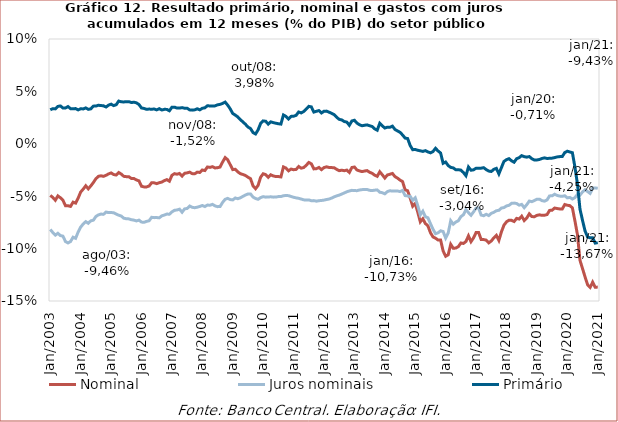
| Category | Nominal | Juros nominais | Primário |
|---|---|---|---|
| 2003-01-01 | -0.049 | -0.082 | 0.032 |
| 2003-02-01 | -0.051 | -0.085 | 0.034 |
| 2003-03-01 | -0.054 | -0.087 | 0.033 |
| 2003-04-01 | -0.05 | -0.085 | 0.036 |
| 2003-05-01 | -0.051 | -0.088 | 0.036 |
| 2003-06-01 | -0.054 | -0.088 | 0.034 |
| 2003-07-01 | -0.059 | -0.093 | 0.034 |
| 2003-08-01 | -0.059 | -0.095 | 0.036 |
| 2003-09-01 | -0.06 | -0.093 | 0.034 |
| 2003-10-01 | -0.056 | -0.089 | 0.033 |
| 2003-11-01 | -0.057 | -0.09 | 0.034 |
| 2003-12-01 | -0.052 | -0.084 | 0.032 |
| 2004-01-01 | -0.046 | -0.079 | 0.033 |
| 2004-02-01 | -0.043 | -0.076 | 0.033 |
| 2004-03-01 | -0.04 | -0.074 | 0.034 |
| 2004-04-01 | -0.043 | -0.076 | 0.033 |
| 2004-05-01 | -0.04 | -0.073 | 0.033 |
| 2004-06-01 | -0.037 | -0.073 | 0.036 |
| 2004-07-01 | -0.033 | -0.069 | 0.036 |
| 2004-08-01 | -0.031 | -0.068 | 0.037 |
| 2004-09-01 | -0.031 | -0.067 | 0.036 |
| 2004-10-01 | -0.031 | -0.067 | 0.036 |
| 2004-11-01 | -0.03 | -0.065 | 0.035 |
| 2004-12-01 | -0.029 | -0.066 | 0.037 |
| 2005-01-01 | -0.028 | -0.066 | 0.038 |
| 2005-02-01 | -0.029 | -0.066 | 0.036 |
| 2005-03-01 | -0.03 | -0.067 | 0.037 |
| 2005-04-01 | -0.027 | -0.068 | 0.041 |
| 2005-05-01 | -0.029 | -0.069 | 0.04 |
| 2005-06-01 | -0.031 | -0.071 | 0.04 |
| 2005-07-01 | -0.031 | -0.072 | 0.04 |
| 2005-08-01 | -0.031 | -0.072 | 0.04 |
| 2005-09-01 | -0.033 | -0.072 | 0.039 |
| 2005-10-01 | -0.033 | -0.073 | 0.04 |
| 2005-11-01 | -0.034 | -0.074 | 0.039 |
| 2005-12-01 | -0.035 | -0.073 | 0.037 |
| 2006-01-01 | -0.041 | -0.075 | 0.034 |
| 2006-02-01 | -0.041 | -0.075 | 0.034 |
| 2006-03-01 | -0.041 | -0.074 | 0.033 |
| 2006-04-01 | -0.04 | -0.073 | 0.033 |
| 2006-05-01 | -0.037 | -0.07 | 0.033 |
| 2006-06-01 | -0.037 | -0.07 | 0.033 |
| 2006-07-01 | -0.038 | -0.07 | 0.032 |
| 2006-08-01 | -0.037 | -0.071 | 0.034 |
| 2006-09-01 | -0.037 | -0.069 | 0.032 |
| 2006-10-01 | -0.035 | -0.068 | 0.033 |
| 2006-11-01 | -0.034 | -0.067 | 0.033 |
| 2006-12-01 | -0.036 | -0.067 | 0.032 |
| 2007-01-01 | -0.03 | -0.065 | 0.035 |
| 2007-02-01 | -0.028 | -0.063 | 0.035 |
| 2007-03-01 | -0.029 | -0.063 | 0.034 |
| 2007-04-01 | -0.028 | -0.062 | 0.034 |
| 2007-05-01 | -0.031 | -0.065 | 0.035 |
| 2007-06-01 | -0.028 | -0.062 | 0.034 |
| 2007-07-01 | -0.028 | -0.062 | 0.034 |
| 2007-08-01 | -0.027 | -0.059 | 0.032 |
| 2007-09-01 | -0.028 | -0.061 | 0.032 |
| 2007-10-01 | -0.029 | -0.061 | 0.032 |
| 2007-11-01 | -0.027 | -0.06 | 0.033 |
| 2007-12-01 | -0.027 | -0.06 | 0.032 |
| 2008-01-01 | -0.025 | -0.059 | 0.034 |
| 2008-02-01 | -0.026 | -0.06 | 0.034 |
| 2008-03-01 | -0.022 | -0.058 | 0.036 |
| 2008-04-01 | -0.022 | -0.059 | 0.036 |
| 2008-05-01 | -0.022 | -0.058 | 0.036 |
| 2008-06-01 | -0.023 | -0.059 | 0.036 |
| 2008-07-01 | -0.023 | -0.06 | 0.037 |
| 2008-08-01 | -0.022 | -0.06 | 0.038 |
| 2008-09-01 | -0.017 | -0.056 | 0.039 |
| 2008-10-01 | -0.013 | -0.053 | 0.04 |
| 2008-11-01 | -0.015 | -0.052 | 0.037 |
| 2008-12-01 | -0.02 | -0.053 | 0.033 |
| 2009-01-01 | -0.025 | -0.054 | 0.029 |
| 2009-02-01 | -0.024 | -0.052 | 0.027 |
| 2009-03-01 | -0.027 | -0.052 | 0.026 |
| 2009-04-01 | -0.029 | -0.052 | 0.023 |
| 2009-05-01 | -0.029 | -0.05 | 0.021 |
| 2009-06-01 | -0.03 | -0.049 | 0.019 |
| 2009-07-01 | -0.032 | -0.048 | 0.016 |
| 2009-08-01 | -0.033 | -0.048 | 0.015 |
| 2009-09-01 | -0.04 | -0.051 | 0.011 |
| 2009-10-01 | -0.043 | -0.052 | 0.009 |
| 2009-11-01 | -0.04 | -0.053 | 0.013 |
| 2009-12-01 | -0.032 | -0.051 | 0.019 |
| 2010-01-01 | -0.029 | -0.05 | 0.022 |
| 2010-02-01 | -0.029 | -0.051 | 0.022 |
| 2010-03-01 | -0.032 | -0.051 | 0.019 |
| 2010-04-01 | -0.03 | -0.051 | 0.021 |
| 2010-05-01 | -0.031 | -0.051 | 0.02 |
| 2010-06-01 | -0.031 | -0.051 | 0.02 |
| 2010-07-01 | -0.031 | -0.05 | 0.019 |
| 2010-08-01 | -0.032 | -0.05 | 0.019 |
| 2010-09-01 | -0.022 | -0.05 | 0.028 |
| 2010-10-01 | -0.023 | -0.049 | 0.026 |
| 2010-11-01 | -0.026 | -0.049 | 0.024 |
| 2010-12-01 | -0.024 | -0.05 | 0.026 |
| 2011-01-01 | -0.025 | -0.051 | 0.026 |
| 2011-02-01 | -0.024 | -0.052 | 0.027 |
| 2011-03-01 | -0.022 | -0.052 | 0.03 |
| 2011-04-01 | -0.023 | -0.053 | 0.029 |
| 2011-05-01 | -0.023 | -0.053 | 0.031 |
| 2011-06-01 | -0.02 | -0.054 | 0.033 |
| 2011-07-01 | -0.018 | -0.054 | 0.036 |
| 2011-08-01 | -0.019 | -0.054 | 0.035 |
| 2011-09-01 | -0.024 | -0.054 | 0.03 |
| 2011-10-01 | -0.024 | -0.055 | 0.031 |
| 2011-11-01 | -0.023 | -0.054 | 0.032 |
| 2011-12-01 | -0.025 | -0.054 | 0.029 |
| 2012-01-01 | -0.023 | -0.054 | 0.031 |
| 2012-02-01 | -0.022 | -0.053 | 0.031 |
| 2012-03-01 | -0.023 | -0.053 | 0.03 |
| 2012-04-01 | -0.023 | -0.052 | 0.029 |
| 2012-05-01 | -0.023 | -0.051 | 0.028 |
| 2012-06-01 | -0.024 | -0.05 | 0.025 |
| 2012-07-01 | -0.026 | -0.049 | 0.023 |
| 2012-08-01 | -0.025 | -0.048 | 0.023 |
| 2012-09-01 | -0.026 | -0.047 | 0.021 |
| 2012-10-01 | -0.025 | -0.046 | 0.021 |
| 2012-11-01 | -0.027 | -0.045 | 0.018 |
| 2012-12-01 | -0.023 | -0.044 | 0.022 |
| 2013-01-01 | -0.022 | -0.045 | 0.022 |
| 2013-02-01 | -0.025 | -0.045 | 0.02 |
| 2013-03-01 | -0.026 | -0.044 | 0.018 |
| 2013-04-01 | -0.027 | -0.044 | 0.017 |
| 2013-05-01 | -0.026 | -0.044 | 0.018 |
| 2013-06-01 | -0.026 | -0.044 | 0.018 |
| 2013-07-01 | -0.027 | -0.044 | 0.017 |
| 2013-08-01 | -0.028 | -0.045 | 0.016 |
| 2013-09-01 | -0.03 | -0.044 | 0.014 |
| 2013-10-01 | -0.031 | -0.044 | 0.013 |
| 2013-11-01 | -0.027 | -0.046 | 0.02 |
| 2013-12-01 | -0.03 | -0.047 | 0.017 |
| 2014-01-01 | -0.033 | -0.048 | 0.015 |
| 2014-02-01 | -0.03 | -0.046 | 0.016 |
| 2014-03-01 | -0.029 | -0.045 | 0.016 |
| 2014-04-01 | -0.028 | -0.045 | 0.017 |
| 2014-05-01 | -0.031 | -0.045 | 0.014 |
| 2014-06-01 | -0.033 | -0.045 | 0.012 |
| 2014-07-01 | -0.035 | -0.046 | 0.011 |
| 2014-08-01 | -0.036 | -0.044 | 0.008 |
| 2014-09-01 | -0.044 | -0.049 | 0.005 |
| 2014-10-01 | -0.045 | -0.05 | 0.005 |
| 2014-11-01 | -0.052 | -0.05 | -0.002 |
| 2014-12-01 | -0.06 | -0.054 | -0.006 |
| 2015-01-01 | -0.057 | -0.052 | -0.005 |
| 2015-02-01 | -0.065 | -0.059 | -0.006 |
| 2015-03-01 | -0.074 | -0.068 | -0.007 |
| 2015-04-01 | -0.072 | -0.064 | -0.007 |
| 2015-05-01 | -0.076 | -0.07 | -0.007 |
| 2015-06-01 | -0.078 | -0.071 | -0.008 |
| 2015-07-01 | -0.085 | -0.076 | -0.009 |
| 2015-08-01 | -0.089 | -0.082 | -0.007 |
| 2015-09-01 | -0.09 | -0.086 | -0.004 |
| 2015-10-01 | -0.092 | -0.085 | -0.007 |
| 2015-11-01 | -0.092 | -0.083 | -0.009 |
| 2015-12-01 | -0.102 | -0.084 | -0.019 |
| 2016-01-01 | -0.107 | -0.09 | -0.017 |
| 2016-02-01 | -0.106 | -0.085 | -0.021 |
| 2016-03-01 | -0.096 | -0.073 | -0.023 |
| 2016-04-01 | -0.1 | -0.077 | -0.023 |
| 2016-05-01 | -0.099 | -0.075 | -0.025 |
| 2016-06-01 | -0.098 | -0.073 | -0.025 |
| 2016-07-01 | -0.095 | -0.07 | -0.025 |
| 2016-08-01 | -0.095 | -0.068 | -0.027 |
| 2016-09-01 | -0.093 | -0.063 | -0.03 |
| 2016-10-01 | -0.088 | -0.066 | -0.022 |
| 2016-11-01 | -0.093 | -0.068 | -0.025 |
| 2016-12-01 | -0.09 | -0.065 | -0.025 |
| 2017-01-01 | -0.085 | -0.061 | -0.023 |
| 2017-02-01 | -0.085 | -0.061 | -0.023 |
| 2017-03-01 | -0.091 | -0.068 | -0.023 |
| 2017-04-01 | -0.091 | -0.069 | -0.023 |
| 2017-05-01 | -0.092 | -0.067 | -0.025 |
| 2017-06-01 | -0.095 | -0.069 | -0.026 |
| 2017-07-01 | -0.093 | -0.066 | -0.026 |
| 2017-08-01 | -0.09 | -0.065 | -0.024 |
| 2017-09-01 | -0.087 | -0.064 | -0.023 |
| 2017-10-01 | -0.092 | -0.063 | -0.029 |
| 2017-11-01 | -0.084 | -0.061 | -0.023 |
| 2017-12-01 | -0.078 | -0.061 | -0.017 |
| 2018-01-01 | -0.074 | -0.059 | -0.015 |
| 2018-02-01 | -0.073 | -0.059 | -0.014 |
| 2018-03-01 | -0.073 | -0.057 | -0.016 |
| 2018-04-01 | -0.074 | -0.057 | -0.018 |
| 2018-05-01 | -0.071 | -0.057 | -0.014 |
| 2018-06-01 | -0.072 | -0.059 | -0.013 |
| 2018-07-01 | -0.069 | -0.058 | -0.011 |
| 2018-08-01 | -0.073 | -0.061 | -0.012 |
| 2018-09-01 | -0.071 | -0.058 | -0.013 |
| 2018-10-01 | -0.067 | -0.055 | -0.012 |
| 2018-11-01 | -0.069 | -0.055 | -0.014 |
| 2018-12-01 | -0.07 | -0.054 | -0.015 |
| 2019-01-01 | -0.068 | -0.053 | -0.015 |
| 2019-02-01 | -0.068 | -0.053 | -0.015 |
| 2019-03-01 | -0.068 | -0.054 | -0.014 |
| 2019-04-01 | -0.068 | -0.055 | -0.013 |
| 2019-05-01 | -0.068 | -0.054 | -0.014 |
| 2019-06-01 | -0.064 | -0.05 | -0.014 |
| 2019-07-01 | -0.063 | -0.05 | -0.014 |
| 2019-08-01 | -0.061 | -0.048 | -0.013 |
| 2019-09-01 | -0.062 | -0.049 | -0.013 |
| 2019-10-01 | -0.062 | -0.05 | -0.012 |
| 2019-11-01 | -0.062 | -0.05 | -0.012 |
| 2019-12-01 | -0.058 | -0.05 | -0.008 |
| 2020-01-01 | -0.059 | -0.052 | -0.007 |
| 2020-02-01 | -0.059 | -0.051 | -0.008 |
| 2020-03-01 | -0.061 | -0.053 | -0.008 |
| 2020-04-01 | -0.074 | -0.051 | -0.022 |
| 2020-05-01 | -0.087 | -0.048 | -0.038 |
| 2020-06-01 | -0.111 | -0.049 | -0.062 |
| 2020-07-01 | -0.119 | -0.046 | -0.073 |
| 2020-08-01 | -0.127 | -0.044 | -0.083 |
| 2020-09-01 | -0.135 | -0.046 | -0.089 |
| 2020-10-01 | -0.137 | -0.047 | -0.09 |
| 2020-11-01 | -0.132 | -0.042 | -0.09 |
| 2020-12-01 | -0.137 | -0.042 | -0.095 |
| 2021-01-01 | -0.137 | -0.042 | -0.094 |